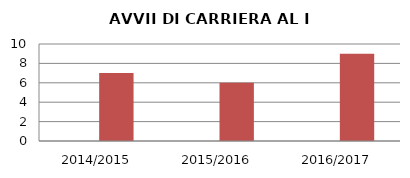
| Category | ANNO | NUMERO |
|---|---|---|
| 2014/2015 | 0 | 7 |
| 2015/2016 | 0 | 6 |
| 2016/2017 | 0 | 9 |